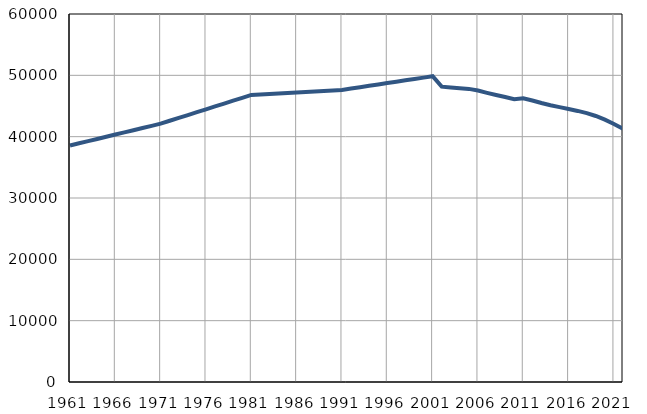
| Category | Број
становника |
|---|---|
| 1961.0 | 38562 |
| 1962.0 | 38918 |
| 1963.0 | 39274 |
| 1964.0 | 39630 |
| 1965.0 | 39986 |
| 1966.0 | 40342 |
| 1967.0 | 40698 |
| 1968.0 | 41054 |
| 1969.0 | 41410 |
| 1970.0 | 41766 |
| 1971.0 | 42122 |
| 1972.0 | 42590 |
| 1973.0 | 43058 |
| 1974.0 | 43526 |
| 1975.0 | 43994 |
| 1976.0 | 44462 |
| 1977.0 | 44931 |
| 1978.0 | 45399 |
| 1979.0 | 45867 |
| 1980.0 | 46335 |
| 1981.0 | 46803 |
| 1982.0 | 46885 |
| 1983.0 | 46966 |
| 1984.0 | 47048 |
| 1985.0 | 47129 |
| 1986.0 | 47210 |
| 1987.0 | 47292 |
| 1988.0 | 47374 |
| 1989.0 | 47455 |
| 1990.0 | 47537 |
| 1991.0 | 47618 |
| 1992.0 | 47841 |
| 1993.0 | 48065 |
| 1994.0 | 48288 |
| 1995.0 | 48511 |
| 1996.0 | 48735 |
| 1997.0 | 48958 |
| 1998.0 | 49182 |
| 1999.0 | 49405 |
| 2000.0 | 49628 |
| 2001.0 | 49852 |
| 2002.0 | 48153 |
| 2003.0 | 48019 |
| 2004.0 | 47909 |
| 2005.0 | 47790 |
| 2006.0 | 47522 |
| 2007.0 | 47146 |
| 2008.0 | 46796 |
| 2009.0 | 46473 |
| 2010.0 | 46110 |
| 2011.0 | 46271 |
| 2012.0 | 45904 |
| 2013.0 | 45493 |
| 2014.0 | 45125 |
| 2015.0 | 44823 |
| 2016.0 | 44516 |
| 2017.0 | 44197 |
| 2018.0 | 43834 |
| 2019.0 | 43370 |
| 2020.0 | 42766 |
| 2021.0 | 42078 |
| 2022.0 | 41301 |